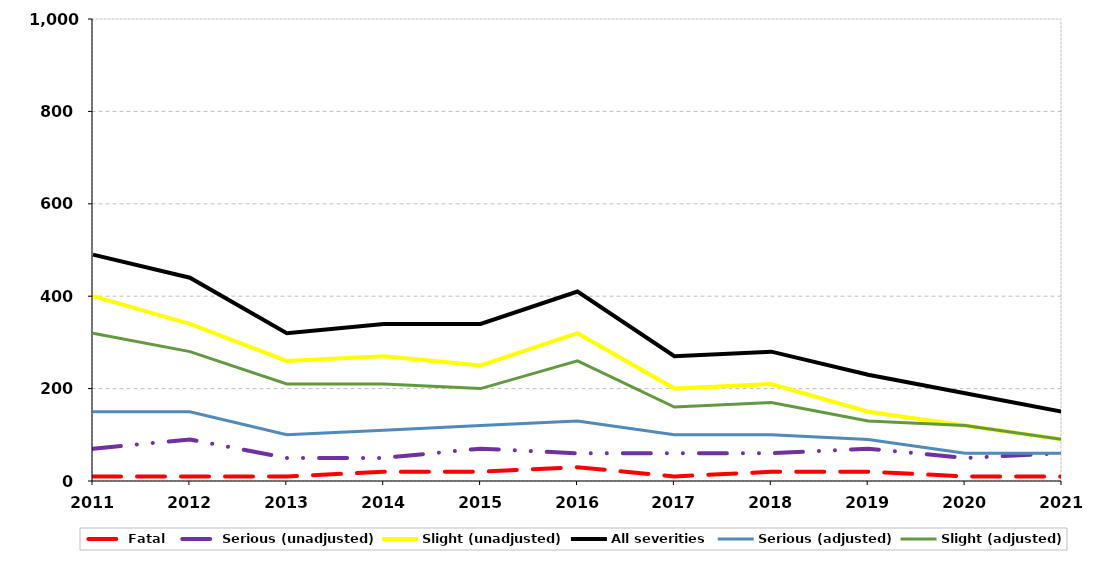
| Category | Fatal | Serious (unadjusted) | Slight (unadjusted) | All severities | Serious (adjusted) | Slight (adjusted) |
|---|---|---|---|---|---|---|
| 2011.0 | 10 | 70 | 400 | 490 | 150 | 320 |
| 2012.0 | 10 | 90 | 340 | 440 | 150 | 280 |
| 2013.0 | 10 | 50 | 260 | 320 | 100 | 210 |
| 2014.0 | 20 | 50 | 270 | 340 | 110 | 210 |
| 2015.0 | 20 | 70 | 250 | 340 | 120 | 200 |
| 2016.0 | 30 | 60 | 320 | 410 | 130 | 260 |
| 2017.0 | 10 | 60 | 200 | 270 | 100 | 160 |
| 2018.0 | 20 | 60 | 210 | 280 | 100 | 170 |
| 2019.0 | 20 | 70 | 150 | 230 | 90 | 130 |
| 2020.0 | 10 | 50 | 120 | 190 | 60 | 120 |
| 2021.0 | 10 | 60 | 90 | 150 | 60 | 90 |